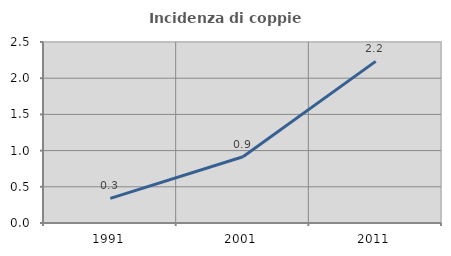
| Category | Incidenza di coppie miste |
|---|---|
| 1991.0 | 0.34 |
| 2001.0 | 0.915 |
| 2011.0 | 2.232 |